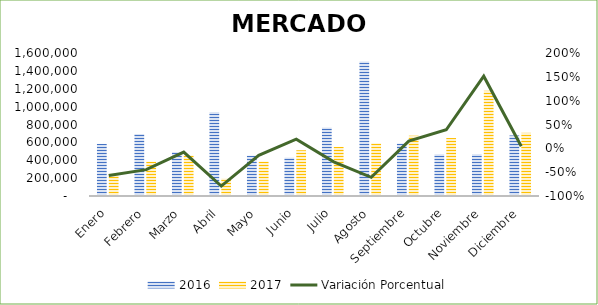
| Category | 2016 | 2017 |
|---|---|---|
| Enero | 582780 | 251695 |
| Febrero | 693719 | 384053 |
| Marzo | 490965 | 452957 |
| Abril | 938714 | 195209 |
| Mayo | 451280 | 385514 |
| Junio | 429116 | 511837 |
| Julio | 765470 | 549279 |
| Agosto | 1506029 | 589000 |
| Septiembre | 586493 | 674745 |
| Octubre | 467044 | 648548 |
| Noviembre | 468073 | 1176596 |
| Diciembre | 677281 | 706913 |